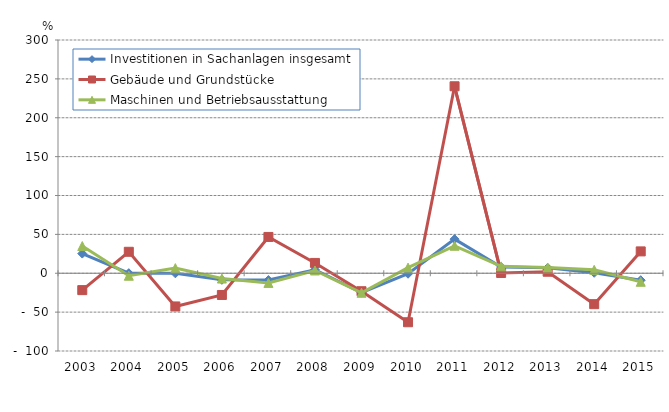
| Category | Investitionen in Sachanlagen insgesamt | Gebäude und Grundstücke | Maschinen und Betriebsausstattung |
|---|---|---|---|
| 2003.0 | 25.3 | -21.7 | 35 |
| 2004.0 | 0.1 | 27.6 | -3.2 |
| 2005.0 | -0.1 | -42.7 | 6.6 |
| 2006.0 | -8.473 | -27.938 | -6.81 |
| 2007.0 | -8.766 | 46.686 | -12.43 |
| 2008.0 | 4.511 | 13.27 | 3.542 |
| 2009.0 | -24.896 | -23.131 | -25.113 |
| 2010.0 | -0.603 | -63.013 | 7.236 |
| 2011.0 | 43.839 | 240.491 | 35.319 |
| 2012.0 | 8.013 | 0.373 | 8.846 |
| 2013.0 | 6.929 | 1.955 | 7.43 |
| 2014.0 | 0.591 | -39.757 | 4.441 |
| 2015.0 | -8.949 | 28.11 | -10.989 |